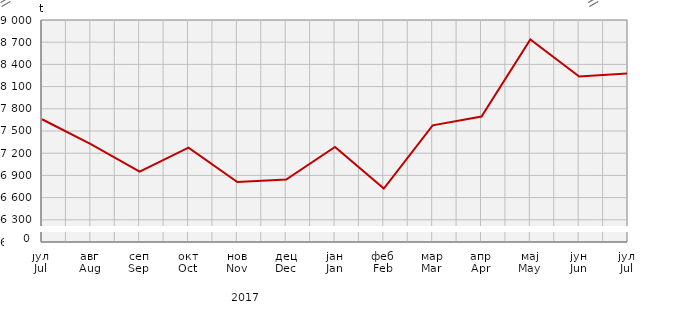
| Category | Прикупљање крављег млијека
Collecting of cow’s milk |
|---|---|
| јул
Jul | 7659 |
| авг
Aug | 7323 |
| сеп
Sep | 6949.6 |
| окт
Oct | 7275 |
| нов
Nov | 6810.8 |
| дец
Dec | 6844 |
| јан
Jan | 7283.5 |
| феб
Feb | 6721.8 |
| мар
Mar | 7575.8 |
| апр
Apr | 7695.5 |
| мај
May | 8737.947 |
| јун
Jun | 8235.2 |
| јул
Jul | 8277.3 |